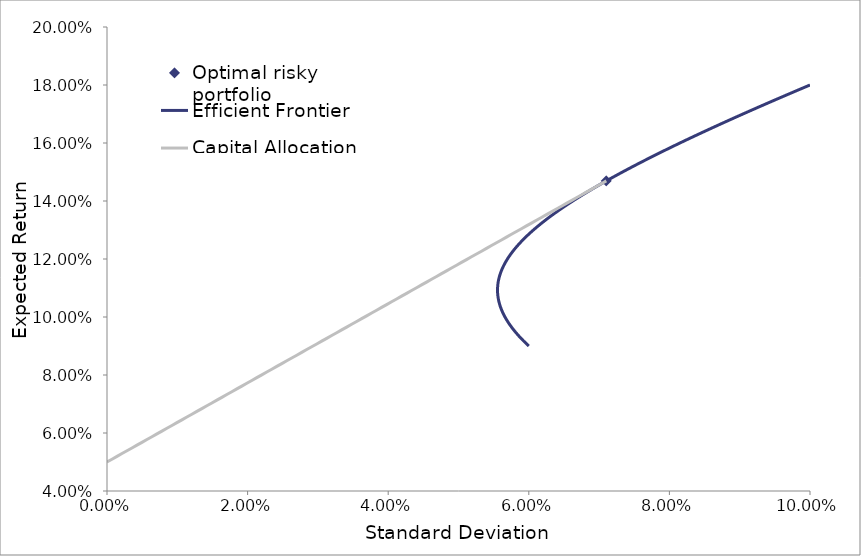
| Category | Optimal risky portfolio |
|---|---|
| 0.07102754870776182 | 0.147 |